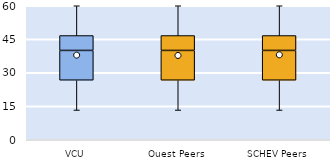
| Category | 25th | 50th | 75th |
|---|---|---|---|
| VCU | 26.667 | 13.333 | 6.667 |
| Quest Peers | 26.667 | 13.333 | 6.667 |
| SCHEV Peers | 26.667 | 13.333 | 6.667 |